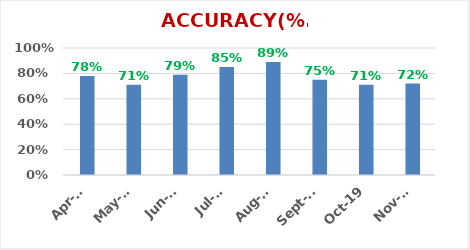
| Category | ACCURACY |
|---|---|
| 2019-11-01 | 0.72 |
| 2019-10-01 | 0.71 |
| 2019-09-01 | 0.75 |
| 2019-08-01 | 0.89 |
| 2019-07-01 | 0.85 |
| 2019-06-01 | 0.79 |
| 2019-05-01 | 0.71 |
| 2019-04-01 | 0.78 |